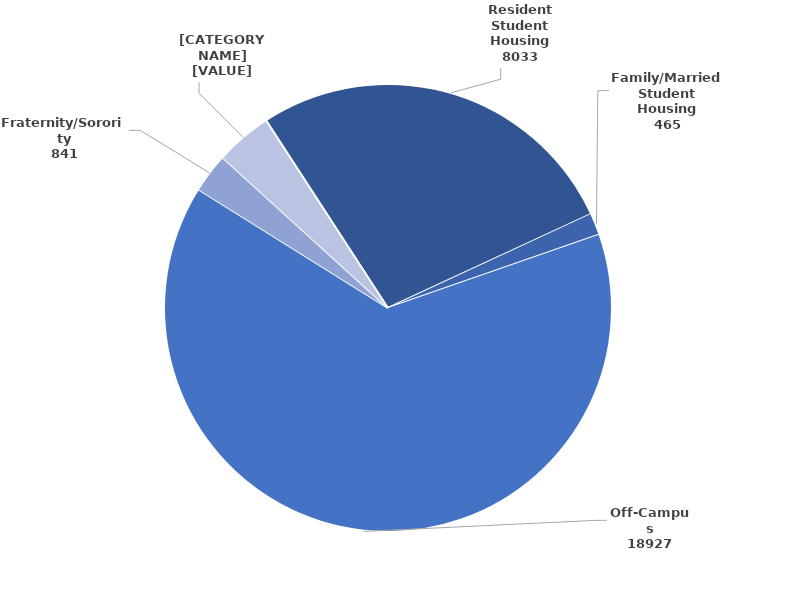
| Category | Series 0 |
|---|---|
| Resident Student Housing | 8033 |
| Family/Married Student Housing | 465 |
| Off-Campus | 18927 |
| Fraternity/Sorority | 841 |
| Other University Affiliated Housing
    (Granville Towers) | 1203 |